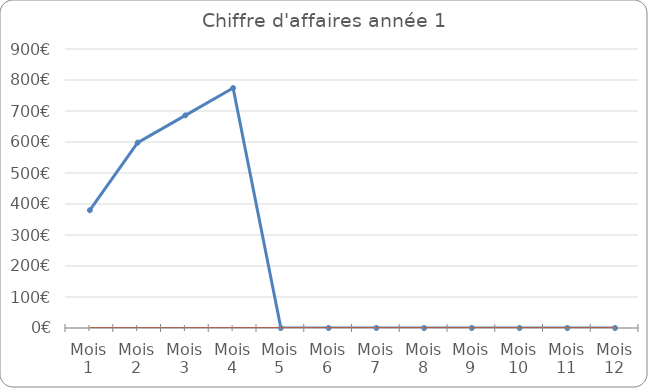
| Category | Chiffre d'affaires | Series 1 |
|---|---|---|
| Mois 1 | 380 |  |
| Mois 2 | 598 |  |
| Mois 3 | 686 |  |
| Mois 4 | 774 |  |
| Mois 5 | 0 |  |
| Mois 6 | 0 |  |
| Mois 7 | 0 |  |
| Mois 8 | 0 |  |
| Mois 9 | 0 |  |
| Mois 10 | 0 |  |
| Mois 11 | 0 |  |
| Mois 12 | 0 |  |